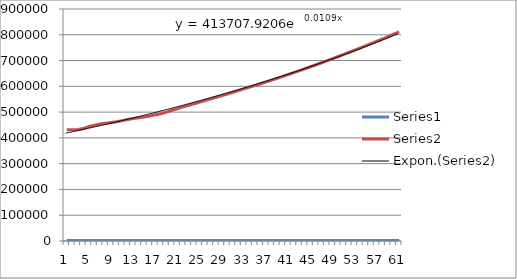
| Category | Series 0 | Series 1 |
|---|---|---|
| 0 | 1990 | 432035 |
| 1 | 1991 | 431155 |
| 2 | 1992 | 432765 |
| 3 | 1993 | 436250 |
| 4 | 1994 | 444244 |
| 5 | 1995 | 448998 |
| 6 | 1996 | 453850 |
| 7 | 1997 | 456506 |
| 8 | 1998 | 459556 |
| 9 | 1999 | 462309 |
| 10 | 2000 | 467029 |
| 11 | 2001 | 471328 |
| 12 | 2002 | 474877 |
| 13 | 2003 | 478054 |
| 14 | 2004 | 481409 |
| 15 | 2005 | 484993 |
| 16 | 2006 | 489797 |
| 17 | 2007 | 493498 |
| 18 | 2008 | 500181 |
| 19 | 2009 | 507328 |
| 20 | 2010 | 513726 |
| 21 | 2011 | 520358 |
| 22 | 2012 | 526089 |
| 23 | 2013 | 532366.423 |
| 24 | 2014 | 538813.428 |
| 25 | 2015 | 544929.462 |
| 26 | 2016 | 551149.74 |
| 27 | 2017 | 557466.689 |
| 28 | 2018 | 563865.408 |
| 29 | 2019 | 570338.142 |
| 30 | 2020 | 576875.926 |
| 31 | 2021 | 583465.969 |
| 32 | 2022 | 590101.429 |
| 33 | 2023 | 596773.194 |
| 34 | 2024 | 603432.74 |
| 35 | 2025 | 610114.695 |
| 36 | 2026 | 617108.708 |
| 37 | 2027 | 624182.896 |
| 38 | 2028 | 631338.179 |
| 39 | 2029 | 638575.486 |
| 40 | 2030 | 645895.758 |
| 41 | 2031 | 653299.945 |
| 42 | 2032 | 660789.009 |
| 43 | 2033 | 668363.924 |
| 44 | 2034 | 676025.673 |
| 45 | 2035 | 683775.253 |
| 46 | 2036 | 691613.669 |
| 47 | 2037 | 699541.941 |
| 48 | 2038 | 707561.098 |
| 49 | 2039 | 715672.181 |
| 50 | 2040 | 723876.246 |
| 51 | 2041 | 732174.358 |
| 52 | 2042 | 740567.594 |
| 53 | 2043 | 749057.046 |
| 54 | 2044 | 757643.817 |
| 55 | 2045 | 766329.021 |
| 56 | 2046 | 775113.787 |
| 57 | 2047 | 783999.257 |
| 58 | 2048 | 792986.585 |
| 59 | 2049 | 802076.939 |
| 60 | 2050 | 811271.5 |